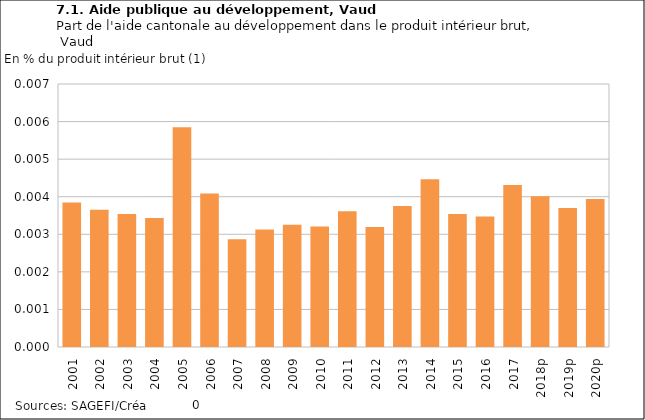
| Category | Part (en %) |
|---|---|
| 2001 | 0.004 |
| 2002 | 0.004 |
| 2003 | 0.004 |
| 2004 | 0.003 |
| 2005 | 0.006 |
| 2006 | 0.004 |
| 2007 | 0.003 |
| 2008 | 0.003 |
| 2009 | 0.003 |
| 2010 | 0.003 |
| 2011 | 0.004 |
| 2012 | 0.003 |
| 2013 | 0.004 |
| 2014 | 0.004 |
| 2015 | 0.004 |
| 2016 | 0.003 |
| 2017 | 0.004 |
| 2018p | 0.004 |
| 2019p | 0.004 |
| 2020p | 0.004 |